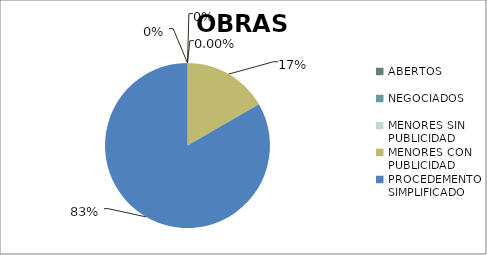
| Category | Series 0 |
|---|---|
| ABERTOS  | 0 |
| NEGOCIADOS  | 0 |
| MENORES SIN PUBLICIDAD | 0 |
| MENORES CON PUBLICIDAD | 0.167 |
| PROCEDEMENTO SIMPLIFICADO | 0.833 |